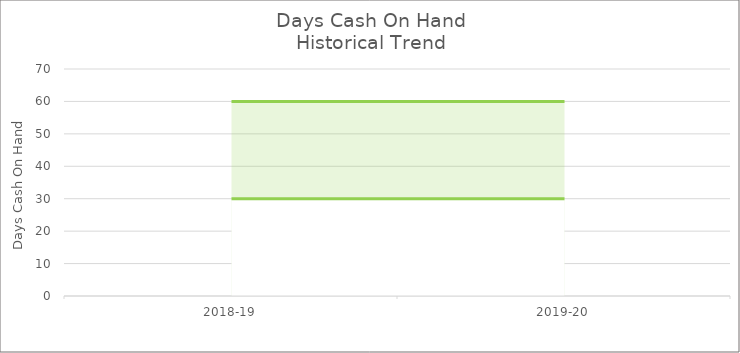
| Category | Days Cash on Hand |
|---|---|
| 2018-19 | 0 |
| 2019-20 | 0 |